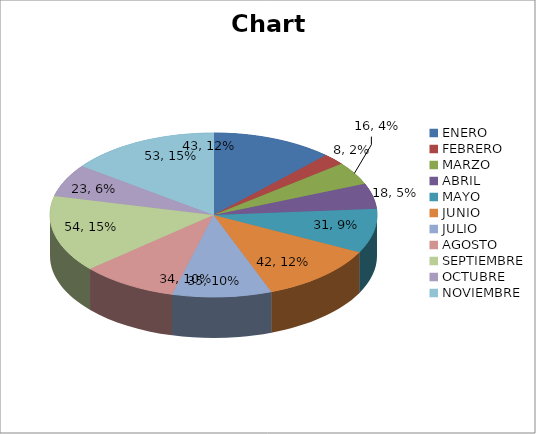
| Category | Series 0 |
|---|---|
| ENERO | 43 |
| FEBRERO | 8 |
| MARZO | 16 |
| ABRIL | 18 |
| MAYO | 31 |
| JUNIO | 42 |
| JULIO | 35 |
| AGOSTO | 34 |
| SEPTIEMBRE | 54 |
| OCTUBRE | 23 |
| NOVIEMBRE | 53 |